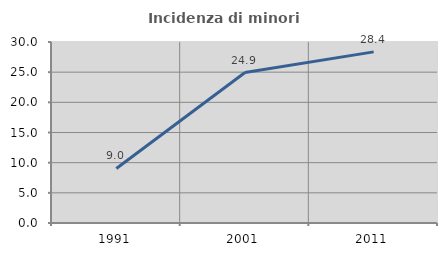
| Category | Incidenza di minori stranieri |
|---|---|
| 1991.0 | 9.04 |
| 2001.0 | 24.943 |
| 2011.0 | 28.363 |